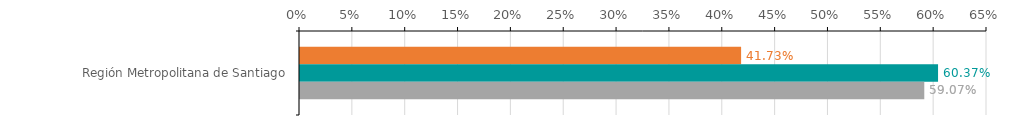
| Category | Numero de operaciones | Monto ($ MM) | Garantia ($ MM) |
|---|---|---|---|
| Región Metropolitana de Santiago | 0.417 | 0.604 | 0.591 |